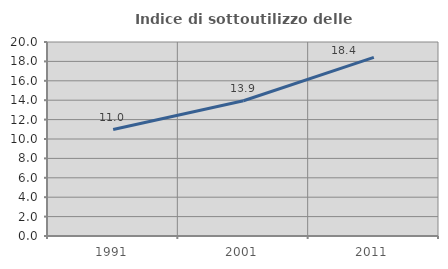
| Category | Indice di sottoutilizzo delle abitazioni  |
|---|---|
| 1991.0 | 10.975 |
| 2001.0 | 13.94 |
| 2011.0 | 18.417 |